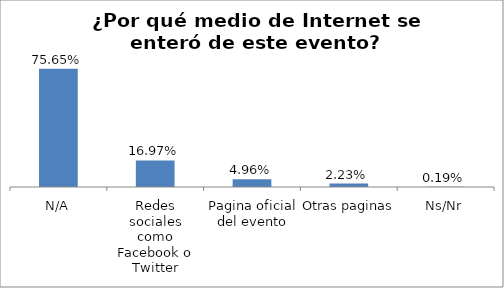
| Category | Total |
|---|---|
| N/A | 0.757 |
| Redes sociales como Facebook o Twitter | 0.17 |
| Pagina oficial del evento | 0.05 |
| Otras paginas | 0.022 |
| Ns/Nr | 0.002 |